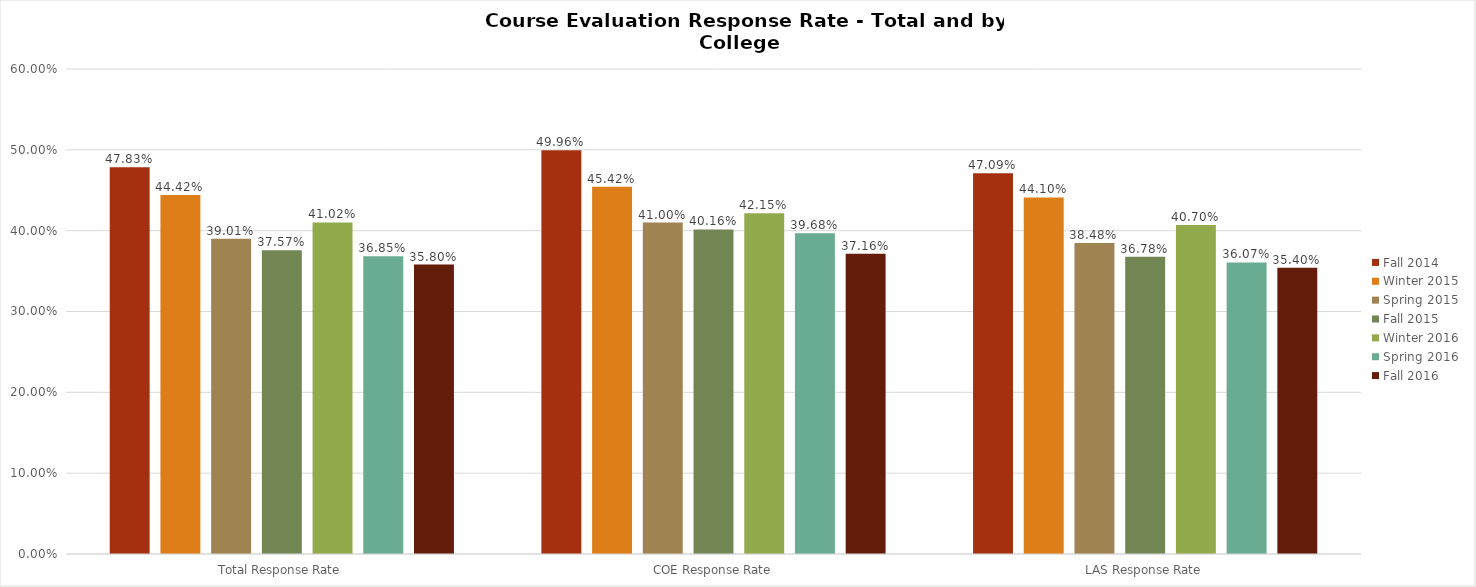
| Category | Fall 2014 | Winter 2015 | Spring 2015 | Fall 2015 | Winter 2016 | Spring 2016 | Fall 2016 |
|---|---|---|---|---|---|---|---|
| Total Response Rate | 0.478 | 0.444 | 0.39 | 0.376 | 0.41 | 0.368 | 0.358 |
| COE Response Rate | 0.5 | 0.454 | 0.41 | 0.402 | 0.422 | 0.397 | 0.372 |
| LAS Response Rate | 0.471 | 0.441 | 0.385 | 0.368 | 0.407 | 0.361 | 0.354 |